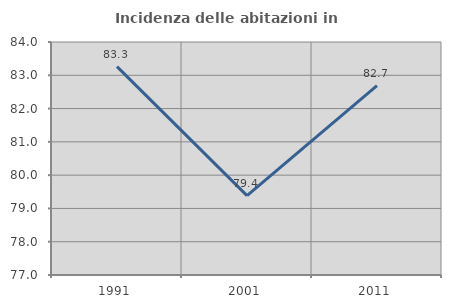
| Category | Incidenza delle abitazioni in proprietà  |
|---|---|
| 1991.0 | 83.261 |
| 2001.0 | 79.385 |
| 2011.0 | 82.689 |